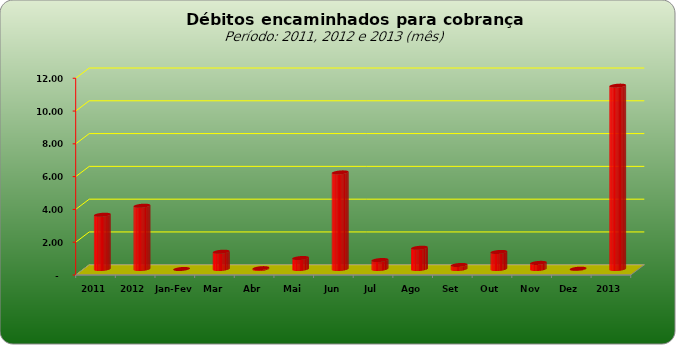
| Category |  3.309.443,02   3.859.728,44   -     1.053.903,71   50.529,60   669.296,13   5.890.806,29   546.448,11   1.296.316,32   245.030,62   1.039.828,93   372.068,71   17.699,83   11.181.928,25  |
|---|---|
| 2011 | 3309443.02 |
| 2012 | 3859728.44 |
| Jan-Fev | 0 |
| Mar | 1053903.71 |
| Abr | 50529.6 |
| Mai | 669296.13 |
| Jun | 5890806.29 |
| Jul | 546448.11 |
| Ago | 1296316.32 |
| Set | 245030.62 |
| Out | 1039828.93 |
| Nov | 372068.71 |
| Dez | 17699.83 |
| 2013 | 11181928.25 |